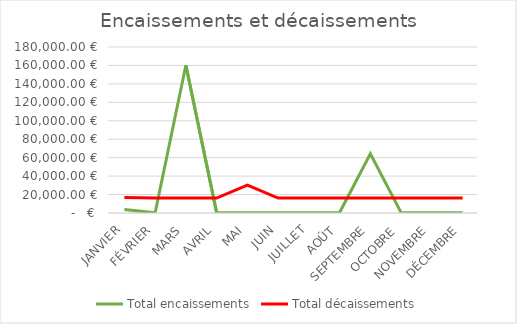
| Category | Total encaissements | Total décaissements |
|---|---|---|
| JANVIER | 3749.76 | 16717.46 |
| FÉVRIER | 234 | 16254.97 |
| MARS | 160253 | 16254.97 |
| AVRIL | 346 | 16254.97 |
| MAI | 354 | 30254.97 |
| JUIN | 213 | 16254.97 |
| JUILLET | 219 | 16254.97 |
| AOÛT | 489 | 16254.97 |
| SEPTEMBRE | 64130 | 16254.97 |
| OCTOBRE | 408 | 16254.97 |
| NOVEMBRE | 344 | 16254.97 |
| DÉCEMBRE | 280 | 16254.97 |